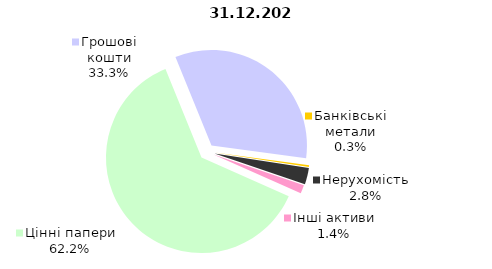
| Category | 31.12.2021 |
|---|---|
| Цінні папери | 2409.121 |
| Грошові кошти | 1290.122 |
| Банківські метали | 10.949 |
| Нерухомість | 108.698 |
| Інші активи | 55.847 |